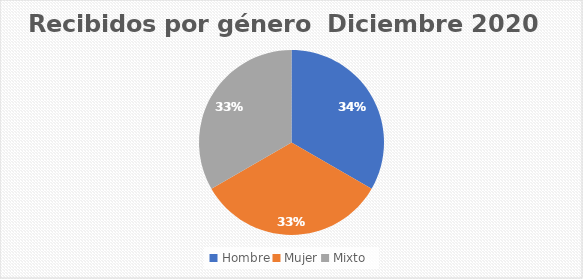
| Category | Recibidos por género  Diciembre |
|---|---|
| Hombre | 2 |
| Mujer | 2 |
| Mixto | 2 |